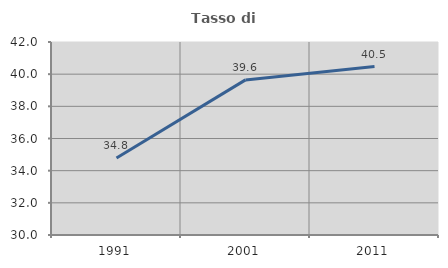
| Category | Tasso di occupazione   |
|---|---|
| 1991.0 | 34.791 |
| 2001.0 | 39.644 |
| 2011.0 | 40.476 |